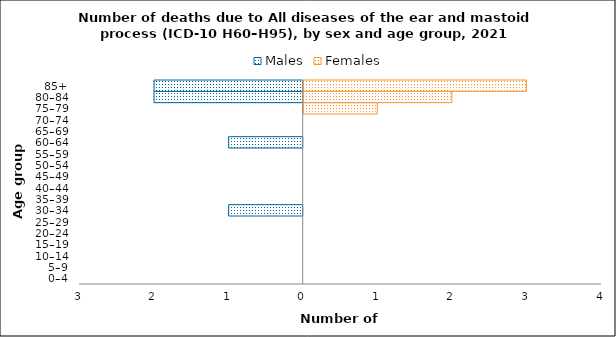
| Category | Males | Females |
|---|---|---|
| 0–4 | 0 | 0 |
| 5–9 | 0 | 0 |
| 10–14 | 0 | 0 |
| 15–19 | 0 | 0 |
| 20–24 | 0 | 0 |
| 25–29 | 0 | 0 |
| 30–34 | -1 | 0 |
| 35–39 | 0 | 0 |
| 40–44 | 0 | 0 |
| 45–49 | 0 | 0 |
| 50–54 | 0 | 0 |
| 55–59 | 0 | 0 |
| 60–64 | -1 | 0 |
| 65–69 | 0 | 0 |
| 70–74 | 0 | 0 |
| 75–79 | 0 | 1 |
| 80–84 | -2 | 2 |
| 85+ | -2 | 3 |